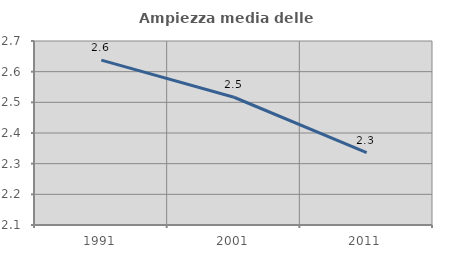
| Category | Ampiezza media delle famiglie |
|---|---|
| 1991.0 | 2.638 |
| 2001.0 | 2.517 |
| 2011.0 | 2.336 |